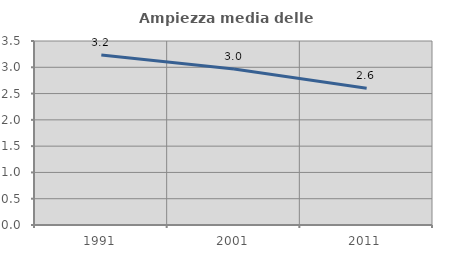
| Category | Ampiezza media delle famiglie |
|---|---|
| 1991.0 | 3.235 |
| 2001.0 | 2.966 |
| 2011.0 | 2.601 |